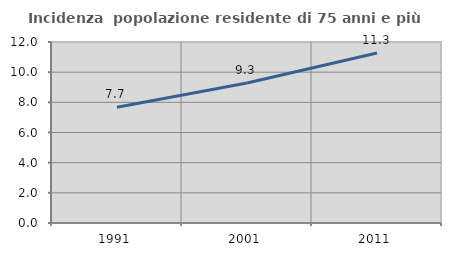
| Category | Incidenza  popolazione residente di 75 anni e più |
|---|---|
| 1991.0 | 7.675 |
| 2001.0 | 9.284 |
| 2011.0 | 11.268 |